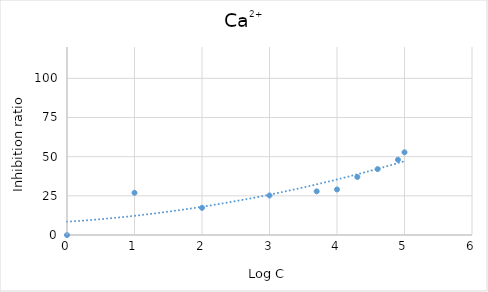
| Category | Ca2+ |
|---|---|
| 0.0 | 0 |
| 1.0 | 26.935 |
| 2.0 | 17.339 |
| 3.0 | 25.213 |
| 3.6989700043360187 | 27.863 |
| 4.0 | 29.068 |
| 4.301029995663981 | 37.033 |
| 4.6020599913279625 | 42.052 |
| 4.903089986991944 | 48.034 |
| 5.0 | 52.773 |